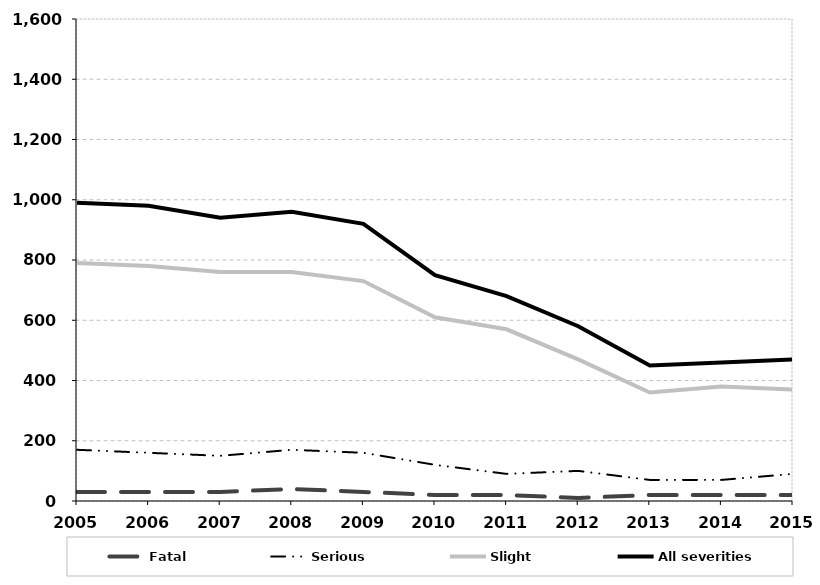
| Category | Fatal | Serious | Slight | All severities |
|---|---|---|---|---|
| 2005.0 | 30 | 170 | 790 | 990 |
| 2006.0 | 30 | 160 | 780 | 980 |
| 2007.0 | 30 | 150 | 760 | 940 |
| 2008.0 | 40 | 170 | 760 | 960 |
| 2009.0 | 30 | 160 | 730 | 920 |
| 2010.0 | 20 | 120 | 610 | 750 |
| 2011.0 | 20 | 90 | 570 | 680 |
| 2012.0 | 10 | 100 | 470 | 580 |
| 2013.0 | 20 | 70 | 360 | 450 |
| 2014.0 | 20 | 70 | 380 | 460 |
| 2015.0 | 20 | 90 | 370 | 470 |